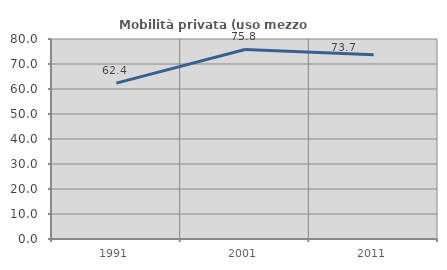
| Category | Mobilità privata (uso mezzo privato) |
|---|---|
| 1991.0 | 62.356 |
| 2001.0 | 75.811 |
| 2011.0 | 73.669 |